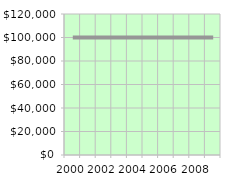
| Category | Avg. Annual
Employee payroll |
|---|---|
| 2000.0 | 100000 |
| 2001.0 | 100000 |
| 2002.0 | 100000 |
| 2003.0 | 100000 |
| 2004.0 | 100000 |
| 2005.0 | 100000 |
| 2006.0 | 100000 |
| 2007.0 | 100000 |
| 2008.0 | 100000 |
| 2009.0 | 100000 |